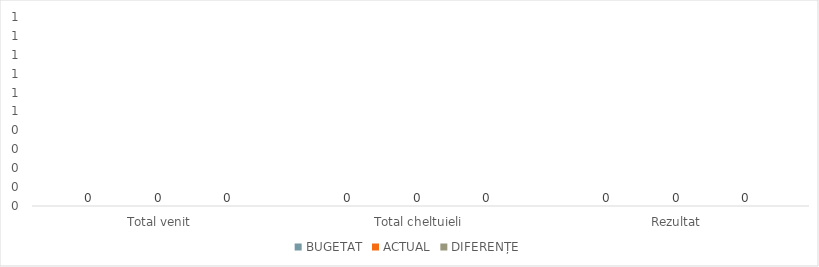
| Category | BUGETAT | ACTUAL | DIFERENȚE |
|---|---|---|---|
| Total venit | 0 | 0 | 0 |
| Total cheltuieli | 0 | 0 | 0 |
| Rezultat  | 0 | 0 | 0 |